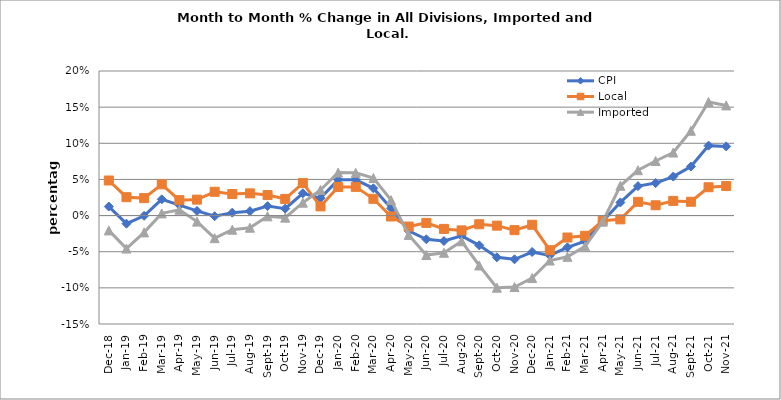
| Category | CPI | Local | Imported |
|---|---|---|---|
| 2018-12-01 | 0.012 | 0.049 | -0.021 |
| 2019-01-01 | -0.011 | 0.025 | -0.046 |
| 2019-02-01 | 0 | 0.024 | -0.023 |
| 2019-03-01 | 0.023 | 0.043 | 0.003 |
| 2019-04-01 | 0.015 | 0.021 | 0.008 |
| 2019-05-01 | 0.006 | 0.022 | -0.008 |
| 2019-06-01 | -0.001 | 0.033 | -0.031 |
| 2019-07-01 | 0.004 | 0.03 | -0.02 |
| 2019-08-01 | 0.006 | 0.031 | -0.017 |
| 2019-09-01 | 0.013 | 0.028 | -0.001 |
| 2019-10-01 | 0.01 | 0.023 | -0.003 |
| 2019-11-01 | 0.031 | 0.045 | 0.018 |
| 2019-12-01 | 0.024 | 0.013 | 0.035 |
| 2020-01-01 | 0.049 | 0.039 | 0.059 |
| 2020-02-01 | 0.05 | 0.04 | 0.059 |
| 2020-03-01 | 0.038 | 0.023 | 0.052 |
| 2020-04-01 | 0.01 | -0.001 | 0.021 |
| 2020-05-01 | -0.021 | -0.015 | -0.027 |
| 2020-06-01 | -0.033 | -0.01 | -0.055 |
| 2020-07-01 | -0.035 | -0.018 | -0.051 |
| 2020-08-01 | -0.028 | -0.02 | -0.036 |
| 2020-09-01 | -0.041 | -0.012 | -0.069 |
| 2020-10-01 | -0.058 | -0.014 | -0.1 |
| 2020-11-01 | -0.06 | -0.02 | -0.099 |
| 2020-12-01 | -0.05 | -0.013 | -0.086 |
| 2021-01-01 | -0.055 | -0.048 | -0.062 |
| 2021-02-01 | -0.044 | -0.03 | -0.057 |
| 2021-03-01 | -0.035 | -0.028 | -0.043 |
| 2021-04-01 | -0.008 | -0.007 | -0.008 |
| 2021-05-01 | 0.018 | -0.005 | 0.041 |
| 2021-06-01 | 0.041 | 0.019 | 0.063 |
| 2021-07-01 | 0.045 | 0.014 | 0.075 |
| 2021-08-01 | 0.054 | 0.02 | 0.087 |
| 2021-09-01 | 0.068 | 0.019 | 0.117 |
| 2021-10-01 | 0.097 | 0.039 | 0.157 |
| 2021-11-01 | 0.096 | 0.041 | 0.152 |